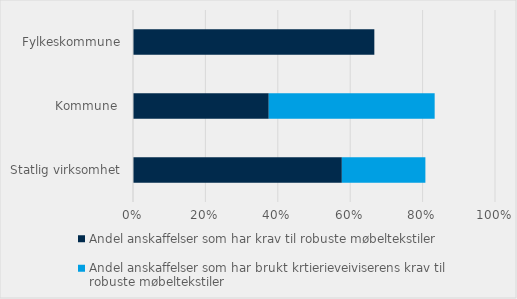
| Category | Andel anskaffelser som har krav til robuste møbeltekstiler | Andel anskaffelser som har brukt krtierieveiviserens krav til robuste møbeltekstiler |
|---|---|---|
| Statlig virksomhet | 0.577 | 0.231 |
| Kommune  | 0.375 | 0.458 |
| Fylkeskommune | 0.667 | 0 |